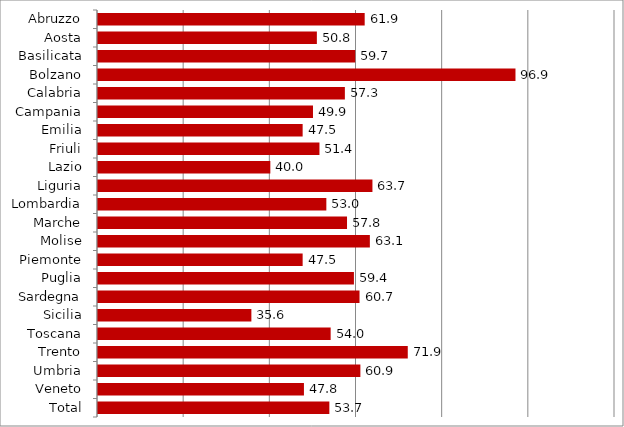
| Category | Regioni |
|---|---|
| Abruzzo | 61.9 |
| Aosta | 50.8 |
| Basilicata | 59.7 |
| Bolzano | 96.9 |
| Calabria | 57.3 |
| Campania | 49.9 |
| Emilia | 47.5 |
| Friuli | 51.4 |
| Lazio | 40 |
| Liguria | 63.7 |
| Lombardia | 53 |
| Marche | 57.8 |
| Molise | 63.1 |
| Piemonte | 47.5 |
| Puglia | 59.4 |
| Sardegna | 60.7 |
| Sicilia | 35.6 |
| Toscana | 54 |
| Trento | 71.9 |
| Umbria | 60.9 |
| Veneto | 47.8 |
| Total | 53.7 |